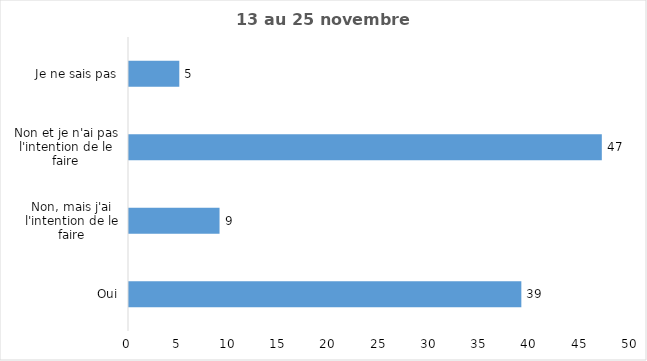
| Category | Series 0 |
|---|---|
| Oui | 39 |
| Non, mais j'ai l'intention de le faire | 9 |
| Non et je n'ai pas l'intention de le faire | 47 |
| Je ne sais pas | 5 |